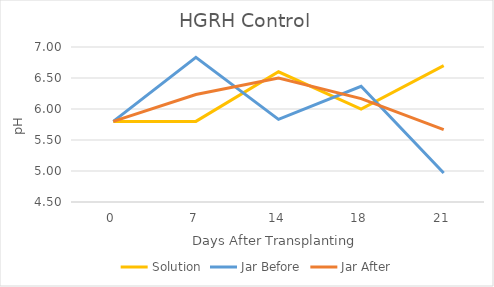
| Category | Solution | Jar Before | Jar After |
|---|---|---|---|
| 0.0 | 5.8 | 5.8 | 5.8 |
| 7.0 | 5.8 | 6.833 | 6.233 |
| 14.0 | 6.6 | 5.833 | 6.5 |
| 18.0 | 6 | 6.367 | 6.167 |
| 21.0 | 6.7 | 4.967 | 5.667 |